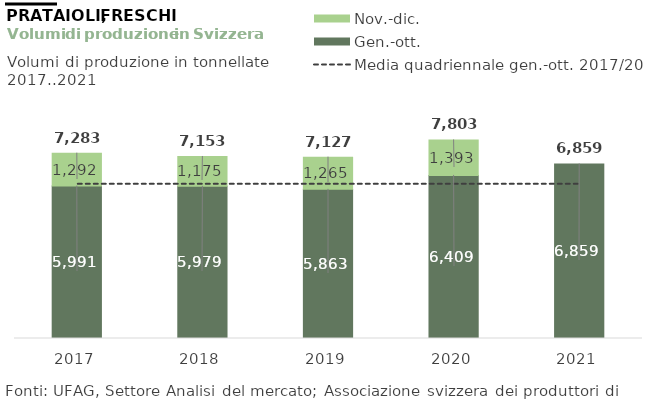
| Category | Gen.-ott. | Nov.-dic. |
|---|---|---|
| 2017 | 5990.974 | 1291.863 |
| 2018 | 5978.717 | 1174.681 |
| 2019 | 5862.522 | 1264.582 |
| 2020 | 6409.093 | 1393.458 |
| 2021 | 6859.492 | 0 |